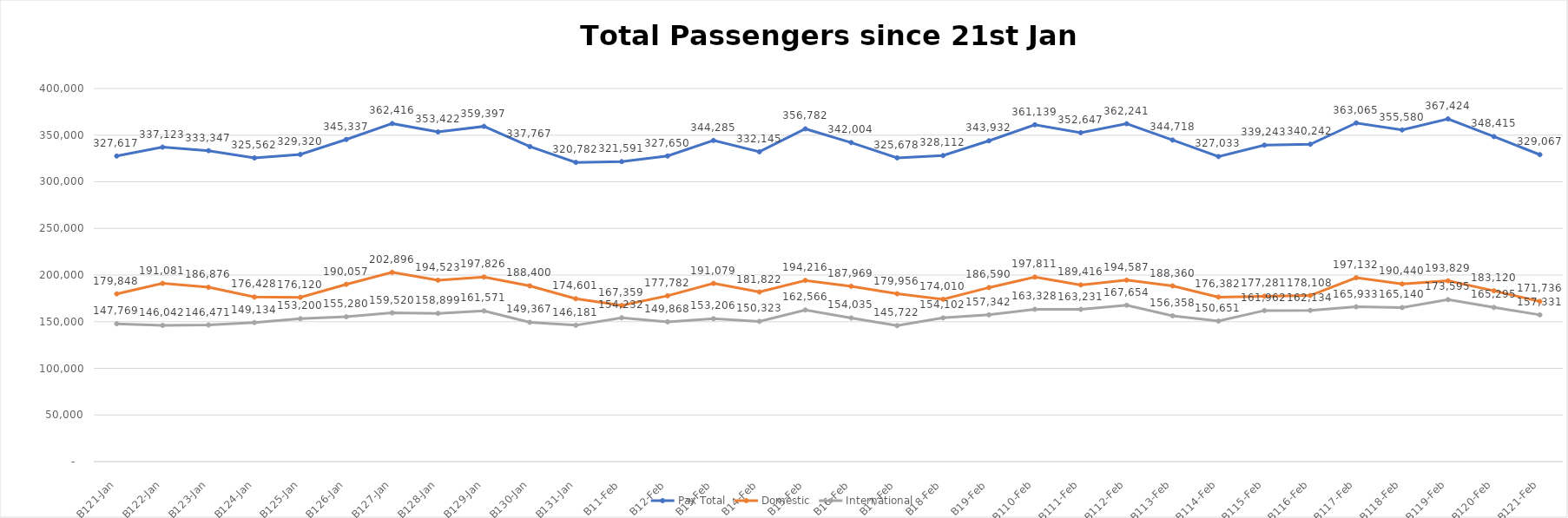
| Category | Pax Total |  Domestic  |  International  |
|---|---|---|---|
| 2023-01-21 | 327617 | 179848 | 147769 |
| 2023-01-22 | 337123 | 191081 | 146042 |
| 2023-01-23 | 333347 | 186876 | 146471 |
| 2023-01-24 | 325562 | 176428 | 149134 |
| 2023-01-25 | 329320 | 176120 | 153200 |
| 2023-01-26 | 345337 | 190057 | 155280 |
| 2023-01-27 | 362416 | 202896 | 159520 |
| 2023-01-28 | 353422 | 194523 | 158899 |
| 2023-01-29 | 359397 | 197826 | 161571 |
| 2023-01-30 | 337767 | 188400 | 149367 |
| 2023-01-31 | 320782 | 174601 | 146181 |
| 2023-02-01 | 321591 | 167359 | 154232 |
| 2023-02-02 | 327650 | 177782 | 149868 |
| 2023-02-03 | 344285 | 191079 | 153206 |
| 2023-02-04 | 332145 | 181822 | 150323 |
| 2023-02-05 | 356782 | 194216 | 162566 |
| 2023-02-06 | 342004 | 187969 | 154035 |
| 2023-02-07 | 325678 | 179956 | 145722 |
| 2023-02-08 | 328112 | 174010 | 154102 |
| 2023-02-09 | 343932 | 186590 | 157342 |
| 2023-02-10 | 361139 | 197811 | 163328 |
| 2023-02-11 | 352647 | 189416 | 163231 |
| 2023-02-12 | 362241 | 194587 | 167654 |
| 2023-02-13 | 344718 | 188360 | 156358 |
| 2023-02-14 | 327033 | 176382 | 150651 |
| 2023-02-15 | 339243 | 177281 | 161962 |
| 2023-02-16 | 340242 | 178108 | 162134 |
| 2023-02-17 | 363065 | 197132 | 165933 |
| 2023-02-18 | 355580 | 190440 | 165140 |
| 2023-02-19 | 367424 | 193829 | 173595 |
| 2023-02-20 | 348415 | 183120 | 165295 |
| 2023-02-21 | 329067 | 171736 | 157331 |